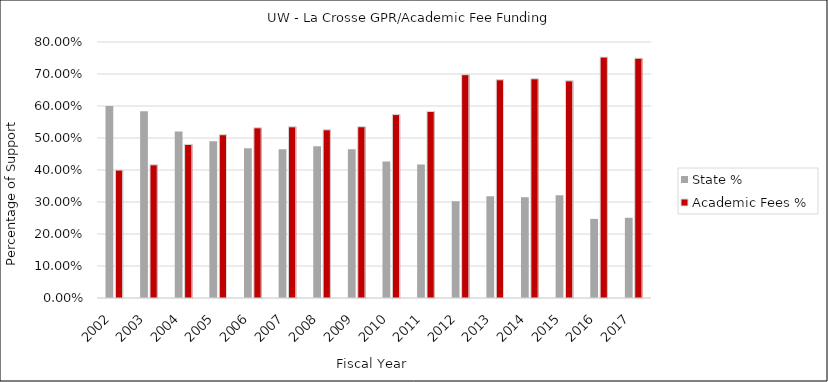
| Category | State % | Academic Fees % |
|---|---|---|
| 2002.0 | 0.6 | 0.4 |
| 2003.0 | 0.584 | 0.416 |
| 2004.0 | 0.52 | 0.48 |
| 2005.0 | 0.49 | 0.51 |
| 2006.0 | 0.468 | 0.532 |
| 2007.0 | 0.465 | 0.535 |
| 2008.0 | 0.474 | 0.526 |
| 2009.0 | 0.465 | 0.535 |
| 2010.0 | 0.427 | 0.573 |
| 2011.0 | 0.417 | 0.583 |
| 2012.0 | 0.302 | 0.698 |
| 2013.0 | 0.318 | 0.682 |
| 2014.0 | 0.315 | 0.685 |
| 2015.0 | 0.321 | 0.679 |
| 2016.0 | 0.247 | 0.753 |
| 2017.0 | 0.251 | 0.749 |